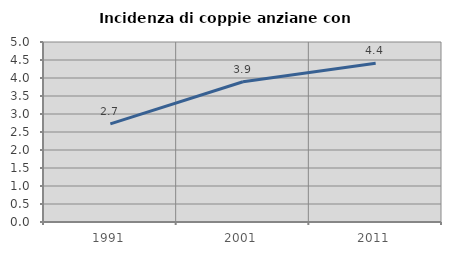
| Category | Incidenza di coppie anziane con figli |
|---|---|
| 1991.0 | 2.727 |
| 2001.0 | 3.896 |
| 2011.0 | 4.412 |